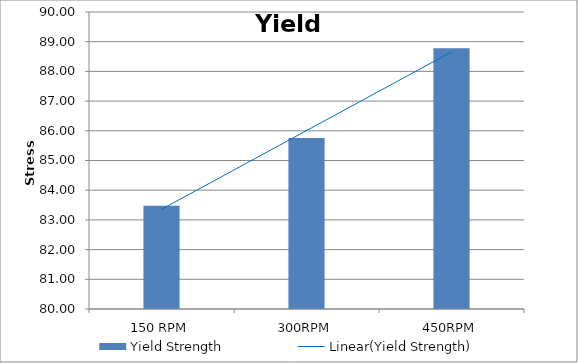
| Category | Yield Strength |
|---|---|
| 150 RPM | 83.48 |
| 300RPM | 85.76 |
| 450RPM | 88.78 |